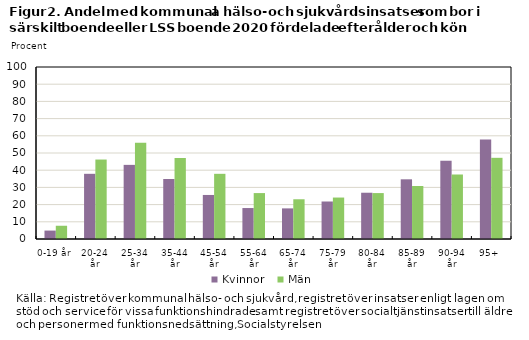
| Category | Kvinnor | Män |
|---|---|---|
| 0-19 år | 4.9 | 7.7 |
| 20-24 år | 37.9 | 46.2 |
| 25-34 år | 43.1 | 56 |
| 35-44 år | 34.9 | 47.1 |
| 45-54 år | 25.6 | 37.9 |
| 55-64 år | 18 | 26.7 |
| 65-74 år | 17.8 | 23.1 |
| 75-79 år | 21.8 | 24.1 |
| 80-84 år | 26.9 | 26.7 |
| 85-89 år | 34.7 | 30.8 |
| 90-94 år | 45.5 | 37.5 |
| 95+ | 57.9 | 47.2 |